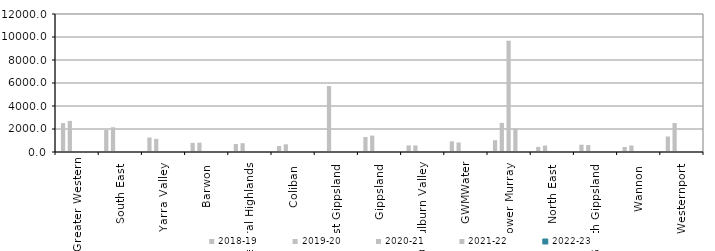
| Category | 2018-19 | 2019-20 | 2020-21 | 2021-22 | 2022-23 |
|---|---|---|---|---|---|
| Greater Western | 2513.92 | 2705.523 | 0 | 0 | 0 |
| South East  | 1919.36 | 2151.879 | 0 | 0 | 0 |
| Yarra Valley  | 1263.83 | 1143.19 | 0 | 0 | 0 |
| Barwon  | 794 | 811.2 | 0 | 0 | 0 |
| Central Highlands  | 695 | 766 | 0 | 0 | 0 |
| Coliban  | 520.66 | 667 | 0 | 0 | 0 |
| East Gippsland  | 0 | 5740.42 | 0 | 0 | 0 |
| Gippsland  | 1302 | 1426 | 0 | 0 | 0 |
| Goulburn Valley  | 573 | 570.41 | 0 | 0 | 0 |
| GWMWater | 928.104 | 831.116 | 0 | 0 | 0 |
| Lower Murray  | 1024.98 | 2534 | 9678.72 | 2041.96 | 0 |
| North East  | 443.43 | 558.86 | 0 | 0 | 0 |
| South Gippsland  | 634.5 | 609 | 0 | 0 | 0 |
| Wannon  | 431 | 566 | 0 | 0 | 0 |
| Westernport  | 1348 | 2523 | 0 | 0 | 0 |